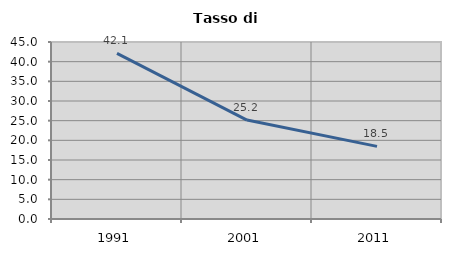
| Category | Tasso di disoccupazione   |
|---|---|
| 1991.0 | 42.105 |
| 2001.0 | 25.156 |
| 2011.0 | 18.458 |